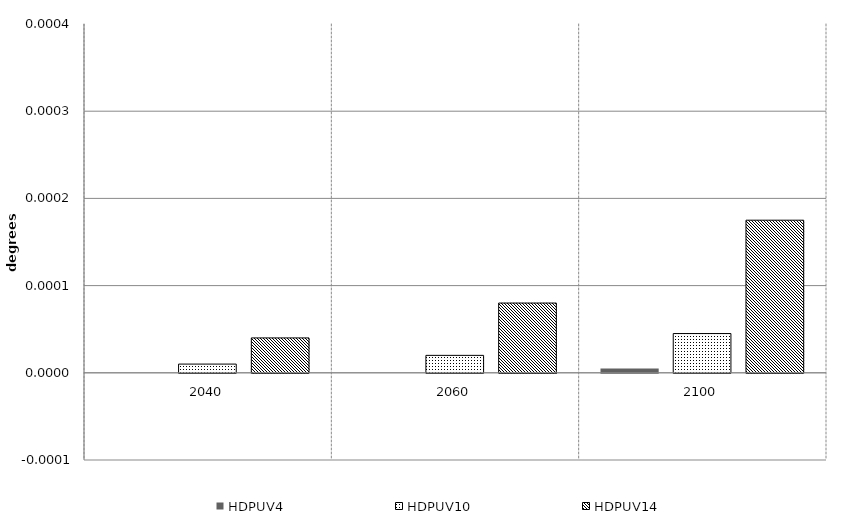
| Category | HDPUV4 | HDPUV10 | HDPUV14 | Alt 5 | Alt 6 | Alt 7 | Alt 8 | Alt 10 |
|---|---|---|---|---|---|---|---|---|
| 2040.0 | 0 | 0 | 0 |  |  |  |  |  |
| 2060.0 | 0 | 0 | 0 |  |  |  |  |  |
| 2100.0 | 0 | 0 | 0 |  |  |  |  |  |